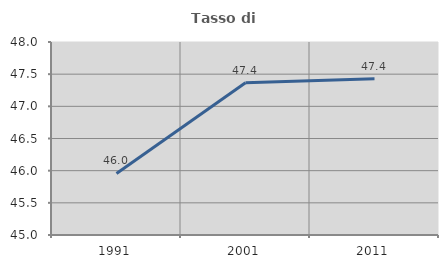
| Category | Tasso di occupazione   |
|---|---|
| 1991.0 | 45.957 |
| 2001.0 | 47.367 |
| 2011.0 | 47.429 |